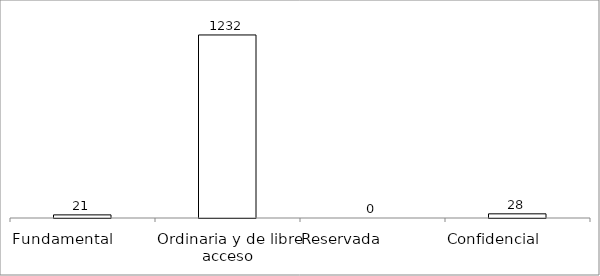
| Category | Series 0 |
|---|---|
| Fundamental         | 21 |
| Ordinaria y de libre acceso | 1232 |
| Reservada               | 0 |
| Confidencial             | 28 |